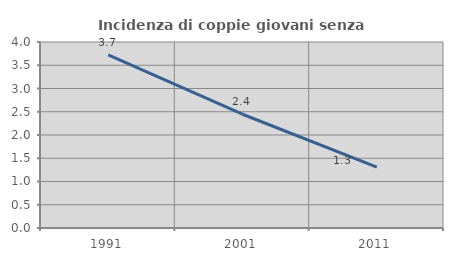
| Category | Incidenza di coppie giovani senza figli |
|---|---|
| 1991.0 | 3.723 |
| 2001.0 | 2.446 |
| 2011.0 | 1.307 |